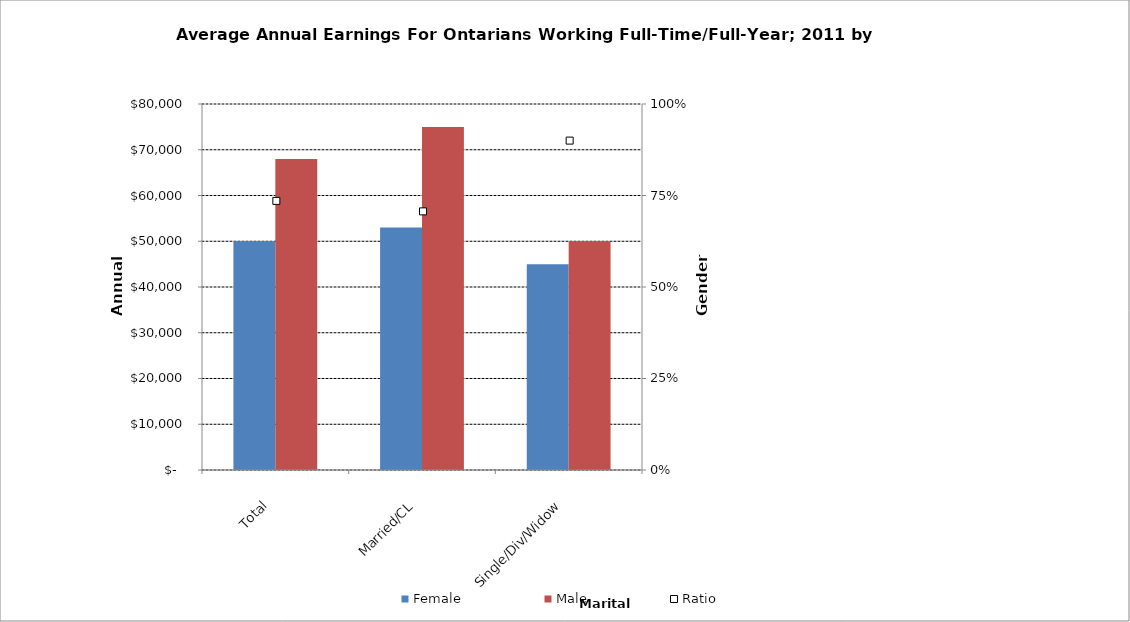
| Category | Female | Male |
|---|---|---|
| Total | 50000 | 68000 |
|  Married/CL  | 53000 | 75000 |
|  Single/Div/Widow  | 45000 | 50000 |